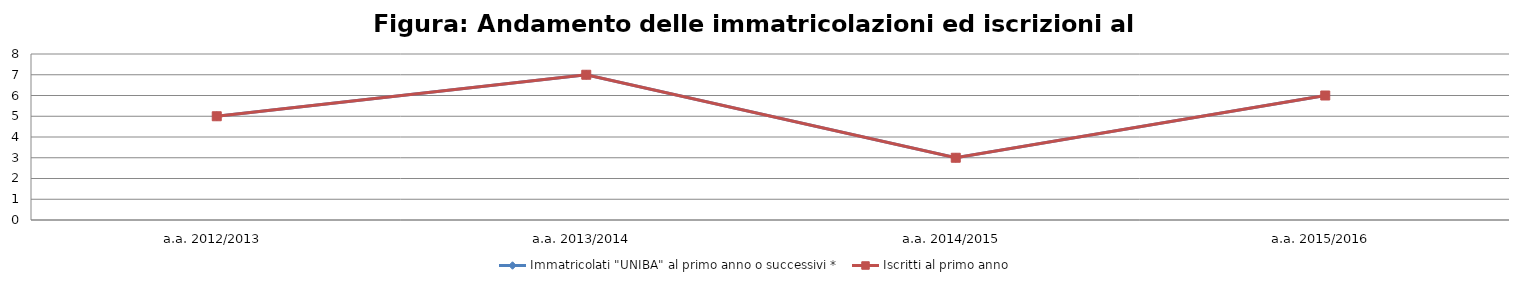
| Category | Immatricolati "UNIBA" al primo anno o successivi * | Iscritti al primo anno  |
|---|---|---|
| a.a. 2012/2013 | 5 | 5 |
| a.a. 2013/2014 | 7 | 7 |
| a.a. 2014/2015 | 3 | 3 |
| a.a. 2015/2016 | 6 | 6 |